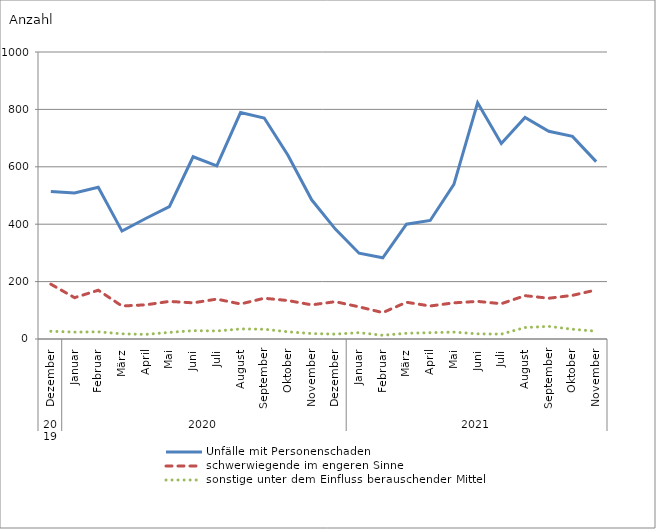
| Category | Unfälle mit Personenschaden | schwerwiegende im engeren Sinne | sonstige unter dem Einfluss berauschender Mittel |
|---|---|---|---|
| 0 | 514 | 191 | 27 |
| 1 | 509 | 144 | 24 |
| 2 | 529 | 170 | 25 |
| 3 | 376 | 115 | 18 |
| 4 | 420 | 119 | 16 |
| 5 | 461 | 131 | 23 |
| 6 | 635 | 126 | 29 |
| 7 | 603 | 139 | 28 |
| 8 | 789 | 122 | 35 |
| 9 | 770 | 142 | 34 |
| 10 | 640 | 134 | 25 |
| 11 | 485 | 119 | 19 |
| 12 | 383 | 130 | 17 |
| 13 | 299 | 112 | 22 |
| 14 | 283 | 92 | 13 |
| 15 | 400 | 128 | 20 |
| 16 | 413 | 115 | 22 |
| 17 | 539 | 126 | 24 |
| 18 | 823 | 131 | 18 |
| 19 | 681 | 123 | 17 |
| 20 | 772 | 151 | 40 |
| 21 | 724 | 142 | 44 |
| 22 | 706 | 152 | 34 |
| 23 | 618 | 171 | 27 |